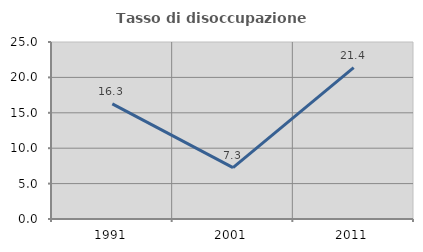
| Category | Tasso di disoccupazione giovanile  |
|---|---|
| 1991.0 | 16.268 |
| 2001.0 | 7.258 |
| 2011.0 | 21.393 |